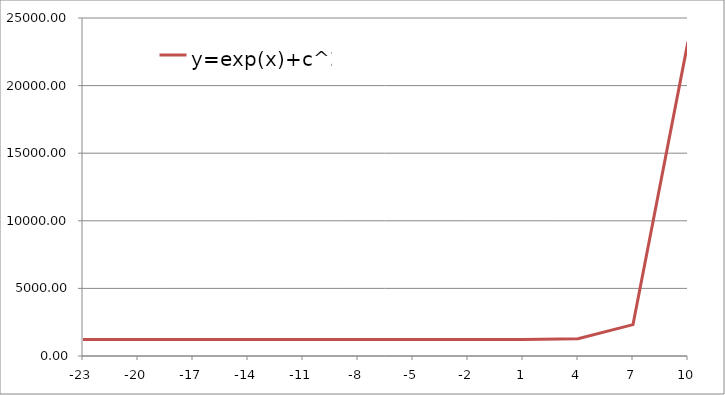
| Category | y=exp(x)+c^2 |
|---|---|
| -23.0 | 1225 |
| -20.0 | 1225 |
| -17.0 | 1225 |
| -14.0 | 1225 |
| -11.0 | 1225 |
| -8.0 | 1225 |
| -5.0 | 1225.007 |
| -2.0 | 1225.135 |
| 1.0 | 1227.718 |
| 4.0 | 1279.598 |
| 7.0 | 2321.633 |
| 10.0 | 23251.466 |